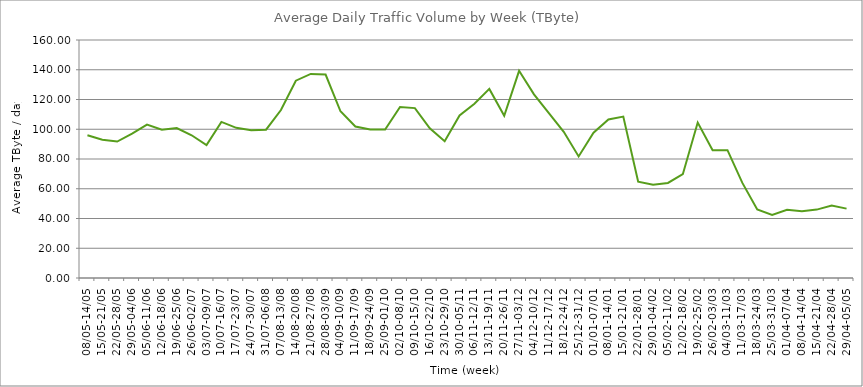
| Category | Average |
|---|---|
| 08/05-14/05 | 95.94 |
| 15/05-21/05 | 92.95 |
| 22/05-28/05 | 91.73 |
| 29/05-04/06 | 97.04 |
| 05/06-11/06 | 103.16 |
| 12/06-18/06 | 99.71 |
| 19/06-25/06 | 100.81 |
| 26/06-02/07 | 95.94 |
| 03/07-09/07 | 89.34 |
| 10/07-16/07 | 104.92 |
| 17/07-23/07 | 100.95 |
| 24/07-30/07 | 99.37 |
| 31/07-06/08 | 99.68 |
| 07/08-13/08 | 112.91 |
| 14/08-20/08 | 132.64 |
| 21/08-27/08 | 137.22 |
| 28/08-03/09 | 136.79 |
| 04/09-10/09 | 112.07 |
| 11/09-17/09 | 101.85 |
| 18/09-24/09 | 99.87 |
| 25/09-01/10 | 99.82 |
| 02/10-08/10 | 114.95 |
| 09/10-15/10 | 114.2 |
| 16/10-22/10 | 100.66 |
| 23/10-29/10 | 91.95 |
| 30/10-05/11 | 109.24 |
| 06/11-12/11 | 117.18 |
| 13/11-19/11 | 127.12 |
| 20/11-26/11 | 109.07 |
| 27/11-03/12 | 139.27 |
| 04/12-10/12 | 123.49 |
| 11/12-17/12 | 110.81 |
| 18/12-24/12 | 98.25 |
| 25/12-31/12 | 81.73 |
| 01/01-07/01 | 97.71 |
| 08/01-14/01 | 106.57 |
| 15/01-21/01 | 108.49 |
| 22/01-28/01 | 64.79 |
| 29/01-04/02 | 62.66 |
| 05/02-11/02 | 63.88 |
| 12/02-18/02 | 69.78 |
| 19/02-25/02 | 104.52 |
| 26/02-03/03 | 85.9 |
| 04/03-11/03 | 85.96 |
| 11/03-17/03 | 63.94 |
| 18/03-24/03 | 46.09 |
| 25/03-31/03 | 42.43 |
| 01/04-07/04 | 45.84 |
| 08/04-14/04 | 44.93 |
| 15/04-21/04 | 45.99 |
| 22/04-28/04 | 48.74 |
| 29/04-05/05 | 46.64 |